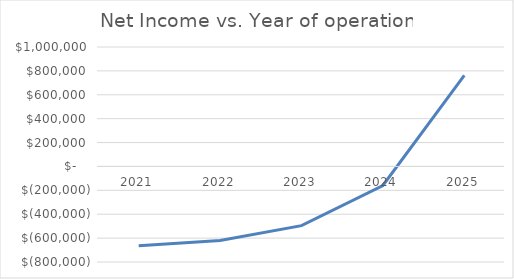
| Category | Series 0 |
|---|---|
| 2021.0 | -663833.333 |
| 2022.0 | -620811.333 |
| 2023.0 | -495635.933 |
| 2024.0 | -159447.791 |
| 2025.0 | 761542.55 |